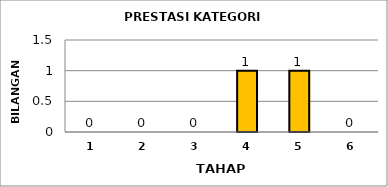
| Category | Series 0 |
|---|---|
| 1.0 | 0 |
| 2.0 | 0 |
| 3.0 | 0 |
| 4.0 | 1 |
| 5.0 | 1 |
| 6.0 | 0 |